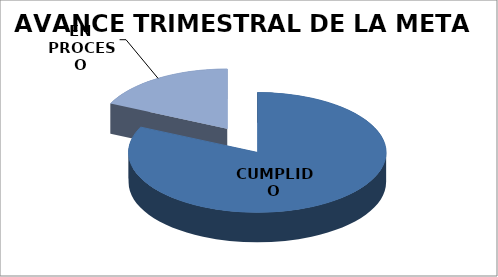
| Category | AVANCE TRIMESTRAL DE LA META |
|---|---|
| CUMPLIDO | 59 |
| EN PROCESO | 13 |